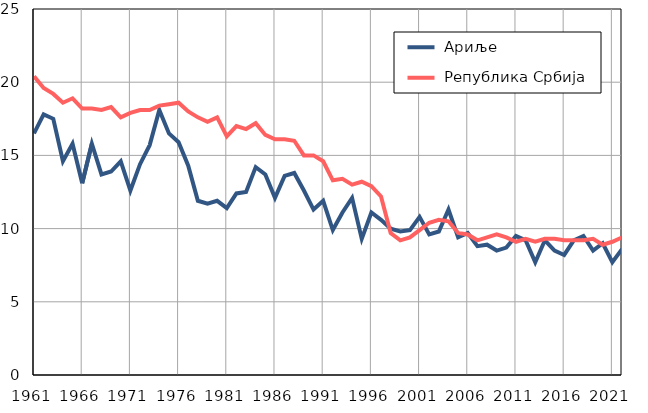
| Category |  Ариље |  Република Србија |
|---|---|---|
| 1961.0 | 16.5 | 20.4 |
| 1962.0 | 17.8 | 19.6 |
| 1963.0 | 17.5 | 19.2 |
| 1964.0 | 14.6 | 18.6 |
| 1965.0 | 15.8 | 18.9 |
| 1966.0 | 13.1 | 18.2 |
| 1967.0 | 15.8 | 18.2 |
| 1968.0 | 13.7 | 18.1 |
| 1969.0 | 13.9 | 18.3 |
| 1970.0 | 14.6 | 17.6 |
| 1971.0 | 12.6 | 17.9 |
| 1972.0 | 14.4 | 18.1 |
| 1973.0 | 15.7 | 18.1 |
| 1974.0 | 18.1 | 18.4 |
| 1975.0 | 16.5 | 18.5 |
| 1976.0 | 15.9 | 18.6 |
| 1977.0 | 14.3 | 18 |
| 1978.0 | 11.9 | 17.6 |
| 1979.0 | 11.7 | 17.3 |
| 1980.0 | 11.9 | 17.6 |
| 1981.0 | 11.4 | 16.3 |
| 1982.0 | 12.4 | 17 |
| 1983.0 | 12.5 | 16.8 |
| 1984.0 | 14.2 | 17.2 |
| 1985.0 | 13.7 | 16.4 |
| 1986.0 | 12.1 | 16.1 |
| 1987.0 | 13.6 | 16.1 |
| 1988.0 | 13.8 | 16 |
| 1989.0 | 12.6 | 15 |
| 1990.0 | 11.3 | 15 |
| 1991.0 | 11.9 | 14.6 |
| 1992.0 | 9.9 | 13.3 |
| 1993.0 | 11.1 | 13.4 |
| 1994.0 | 12.1 | 13 |
| 1995.0 | 9.3 | 13.2 |
| 1996.0 | 11.1 | 12.9 |
| 1997.0 | 10.6 | 12.2 |
| 1998.0 | 10 | 9.7 |
| 1999.0 | 9.8 | 9.2 |
| 2000.0 | 9.9 | 9.4 |
| 2001.0 | 10.8 | 9.9 |
| 2002.0 | 9.6 | 10.4 |
| 2003.0 | 9.8 | 10.6 |
| 2004.0 | 11.3 | 10.5 |
| 2005.0 | 9.4 | 9.7 |
| 2006.0 | 9.7 | 9.6 |
| 2007.0 | 8.8 | 9.2 |
| 2008.0 | 8.9 | 9.4 |
| 2009.0 | 8.5 | 9.6 |
| 2010.0 | 8.7 | 9.4 |
| 2011.0 | 9.5 | 9.1 |
| 2012.0 | 9.2 | 9.3 |
| 2013.0 | 7.7 | 9.1 |
| 2014.0 | 9.2 | 9.3 |
| 2015.0 | 8.5 | 9.3 |
| 2016.0 | 8.2 | 9.2 |
| 2017.0 | 9.2 | 9.2 |
| 2018.0 | 9.5 | 9.2 |
| 2019.0 | 8.5 | 9.3 |
| 2020.0 | 9 | 8.9 |
| 2021.0 | 7.7 | 9.1 |
| 2022.0 | 8.6 | 9.4 |